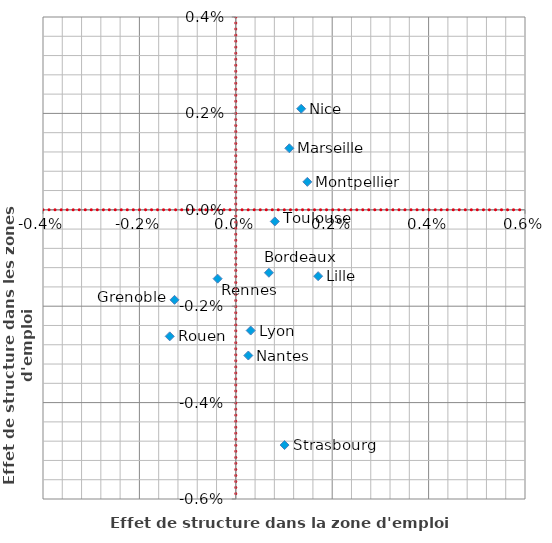
| Category | ZE contigües intrarégionales |
|---|---|
| 0.00030915146411974537 | -0.003 |
| 0.0011102298295368354 | 0.001 |
| 0.000259828313358217 | -0.003 |
| -0.0012708978752874092 | -0.002 |
| 0.0010116427967241314 | -0.005 |
| 0.0006870104933760951 | -0.001 |
| -0.0003774187772337245 | -0.001 |
| 0.0013572275218972402 | 0.002 |
| 0.0014842551297700704 | 0.001 |
| 0.0008094241607722489 | 0 |
| 0.0017085474618510844 | -0.001 |
| -0.0013706622620758319 | -0.003 |